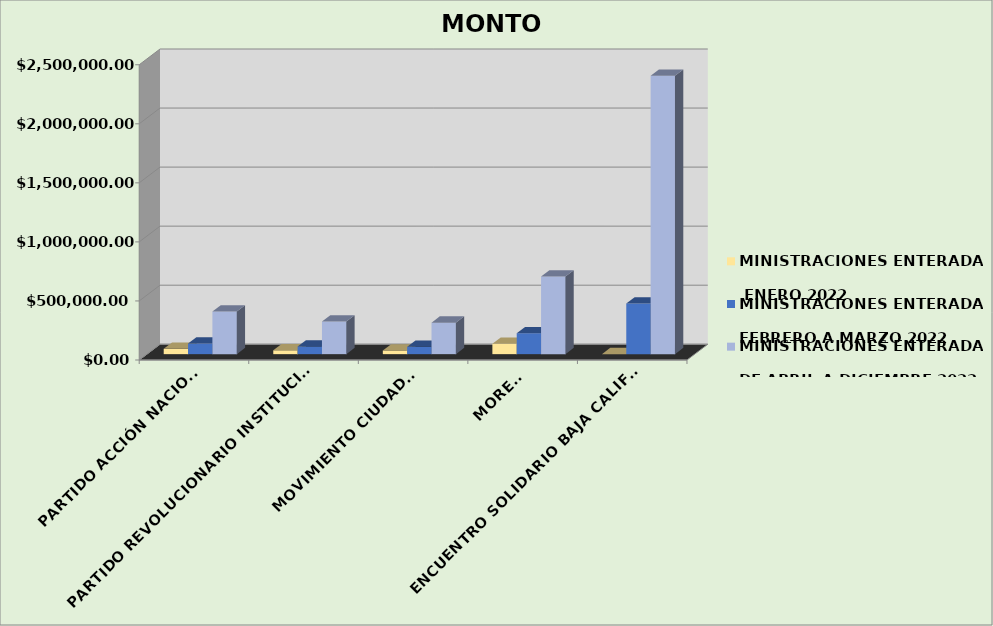
| Category | MINISTRACIONES ENTERADAS 
 ENERO 2022 | MINISTRACIONES ENTERADAS 
FEBRERO A MARZO 2022 | MINISTRACIONES ENTERADAS 
DE ABRIL A DICIEMBRE 2022 |
|---|---|---|---|
| PARTIDO ACCIÓN NACIONAL | 45176.64 | 90353.28 | 361766.97 |
| PARTIDO REVOLUCIONARIO INSTITUCIONAL | 32607.14 | 65214.28 | 276164.37 |
| MOVIMIENTO CIUDADANO | 31198.01 | 62396.02 | 266567.67 |
| MORENA | 88669.58 | 177339.16 | 657968.94 |
| ENCUENTRO SOLIDARIO BAJA CALIFORNIA | 0 | 428244.6 | 2356883.46 |